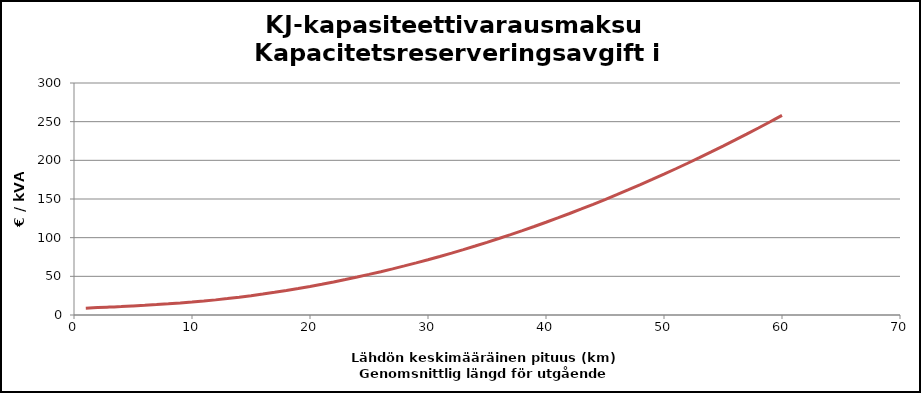
| Category | kapasiteettivarausmaksu |
|---|---|
| 1.0 | 8.756 |
| 2.0 | 9.553 |
| 3.0 | 10.245 |
| 4.0 | 10.905 |
| 5.0 | 11.697 |
| 6.0 | 12.546 |
| 7.0 | 13.446 |
| 8.0 | 14.426 |
| 9.0 | 15.499 |
| 10.0 | 16.691 |
| 11.0 | 18.047 |
| 12.0 | 19.559 |
| 13.0 | 21.223 |
| 14.0 | 23.038 |
| 15.0 | 25 |
| 16.0 | 27.108 |
| 17.0 | 29.361 |
| 18.0 | 31.757 |
| 19.0 | 34.295 |
| 20.0 | 36.975 |
| 21.0 | 39.797 |
| 22.0 | 42.759 |
| 23.0 | 45.862 |
| 24.0 | 49.105 |
| 25.0 | 52.487 |
| 26.0 | 56.01 |
| 27.0 | 59.671 |
| 28.0 | 63.472 |
| 29.0 | 67.412 |
| 30.0 | 71.491 |
| 31.0 | 75.708 |
| 32.0 | 80.065 |
| 33.0 | 84.56 |
| 34.0 | 89.193 |
| 35.0 | 93.965 |
| 36.0 | 98.876 |
| 37.0 | 103.924 |
| 38.0 | 109.112 |
| 39.0 | 114.437 |
| 40.0 | 119.9 |
| 41.0 | 125.502 |
| 42.0 | 131.242 |
| 43.0 | 137.12 |
| 44.0 | 143.136 |
| 45.0 | 149.29 |
| 46.0 | 155.582 |
| 47.0 | 162.013 |
| 48.0 | 168.581 |
| 49.0 | 175.287 |
| 50.0 | 182.131 |
| 51.0 | 189.113 |
| 52.0 | 196.233 |
| 53.0 | 203.491 |
| 54.0 | 210.887 |
| 55.0 | 218.421 |
| 56.0 | 226.093 |
| 57.0 | 233.902 |
| 58.0 | 241.849 |
| 59.0 | 249.935 |
| 60.0 | 258.158 |